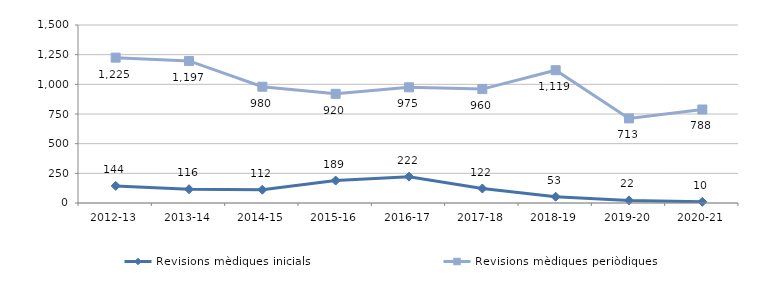
| Category | Revisions mèdiques inicials | Revisions mèdiques periòdiques |
|---|---|---|
| 2012-13 | 144 | 1225 |
| 2013-14 | 116 | 1197 |
| 2014-15 | 112 | 980 |
| 2015-16 | 189 | 920 |
| 2016-17 | 222 | 975 |
| 2017-18 | 122 | 960 |
| 2018-19 | 53 | 1119 |
| 2019-20 | 22 | 713 |
| 2020-21 | 10 | 788 |